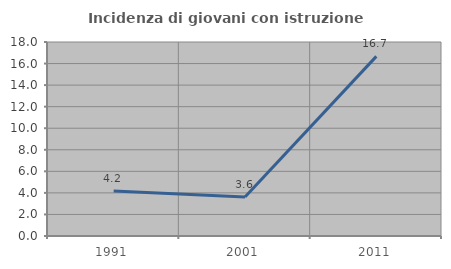
| Category | Incidenza di giovani con istruzione universitaria |
|---|---|
| 1991.0 | 4.167 |
| 2001.0 | 3.614 |
| 2011.0 | 16.667 |